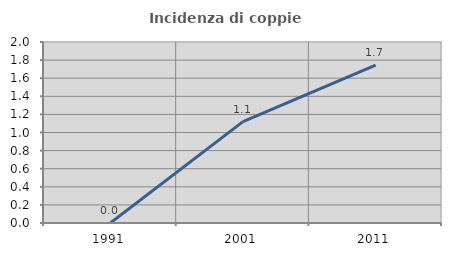
| Category | Incidenza di coppie miste |
|---|---|
| 1991.0 | 0 |
| 2001.0 | 1.12 |
| 2011.0 | 1.744 |